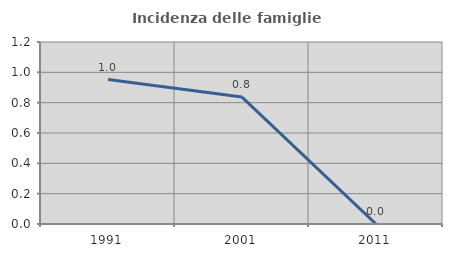
| Category | Incidenza delle famiglie numerose |
|---|---|
| 1991.0 | 0.952 |
| 2001.0 | 0.837 |
| 2011.0 | 0 |